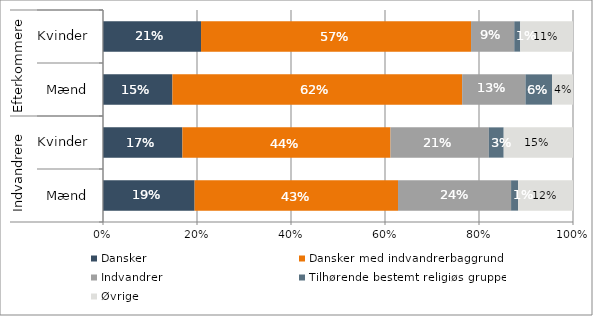
| Category | Dansker | Dansker med indvandrerbaggrund | Indvandrer | Tilhørende bestemt religiøs gruppe | Øvrige |
|---|---|---|---|---|---|
| 0 | 0.195 | 0.433 | 0.241 | 0.015 | 0.117 |
| 1 | 0.169 | 0.443 | 0.209 | 0.032 | 0.147 |
| 2 | 0.148 | 0.616 | 0.135 | 0.057 | 0.045 |
| 3 | 0.209 | 0.574 | 0.092 | 0.013 | 0.112 |